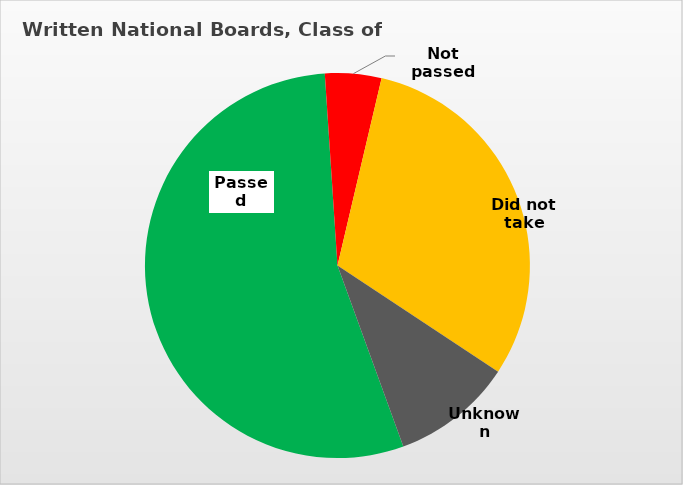
| Category | Series 0 |
|---|---|
| Passed | 0.545 |
| Not passed | 0.047 |
| Did not take | 0.306 |
| Unknown | 0.102 |